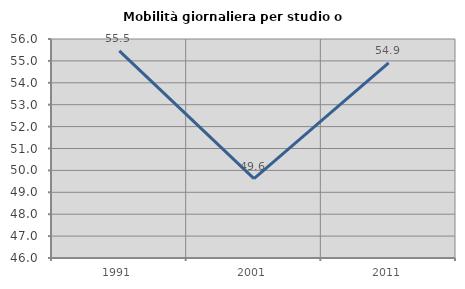
| Category | Mobilità giornaliera per studio o lavoro |
|---|---|
| 1991.0 | 55.457 |
| 2001.0 | 49.627 |
| 2011.0 | 54.911 |